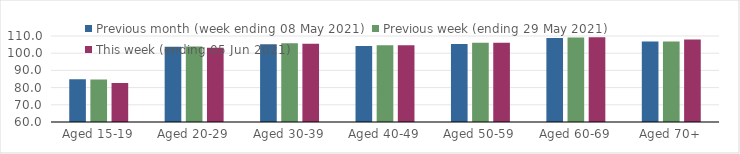
| Category | Previous month (week ending 08 May 2021) | Previous week (ending 29 May 2021) | This week (ending 05 Jun 2021) |
|---|---|---|---|
| Aged 15-19 | 84.85 | 84.71 | 82.68 |
| Aged 20-29 | 103.74 | 103.85 | 103.23 |
| Aged 30-39 | 105.17 | 105.8 | 105.46 |
| Aged 40-49 | 104.18 | 104.69 | 104.57 |
| Aged 50-59 | 105.4 | 106.03 | 106.07 |
| Aged 60-69 | 108.86 | 109.07 | 109.28 |
| Aged 70+ | 106.85 | 106.84 | 107.99 |